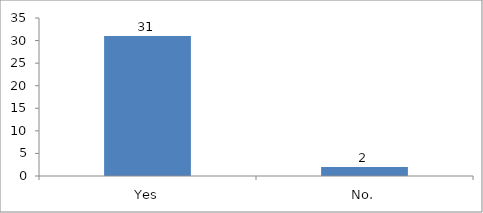
| Category | Was the time allocated for the session sufficient? |
|---|---|
| Yes | 31 |
| No. | 2 |